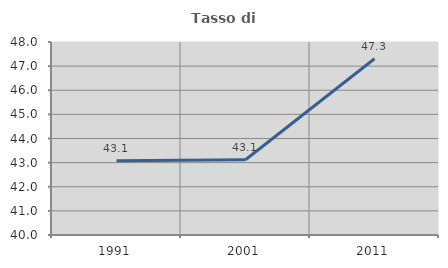
| Category | Tasso di occupazione   |
|---|---|
| 1991.0 | 43.08 |
| 2001.0 | 43.121 |
| 2011.0 | 47.305 |